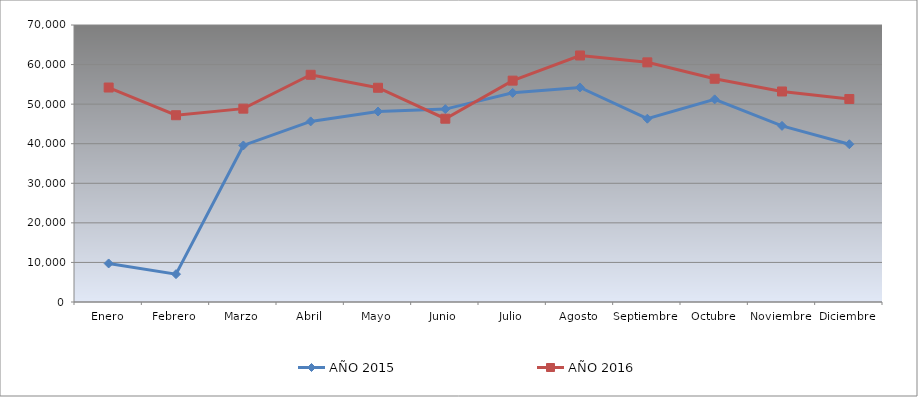
| Category | AÑO 2015 | AÑO 2016 |
|---|---|---|
| Enero | 9740 | 54200 |
| Febrero | 7040 | 47200 |
| Marzo | 39560 | 48860 |
| Abril | 45639.105 | 57420 |
| Mayo | 48133.202 | 54140 |
| Junio | 48744.781 | 46320 |
| Julio | 52853.83 | 55940 |
| Agosto | 54220.327 | 62300 |
| Septiembre | 46317.576 | 60560 |
| Octubre | 51210.21 | 56420 |
| Noviembre | 44511.506 | 53200 |
| Diciembre | 39867.326 | 51300 |